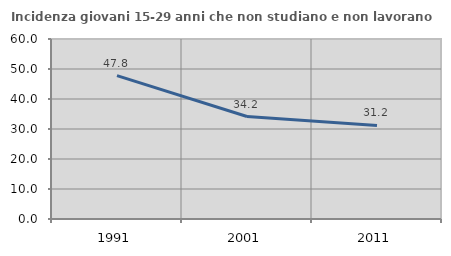
| Category | Incidenza giovani 15-29 anni che non studiano e non lavorano  |
|---|---|
| 1991.0 | 47.8 |
| 2001.0 | 34.155 |
| 2011.0 | 31.188 |